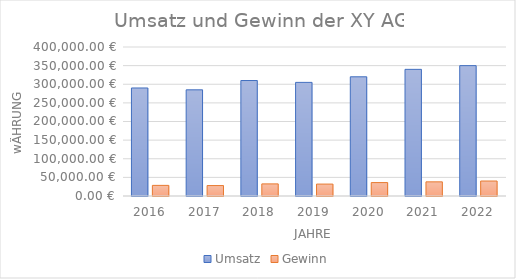
| Category | Umsatz | Gewinn |
|---|---|---|
| 2016.0 | 290000 | 28500 |
| 2017.0 | 285000 | 28000 |
| 2018.0 | 310000 | 32500 |
| 2019.0 | 305000 | 32000 |
| 2020.0 | 320000 | 36000 |
| 2021.0 | 340000 | 38000 |
| 2022.0 | 350000 | 40200 |